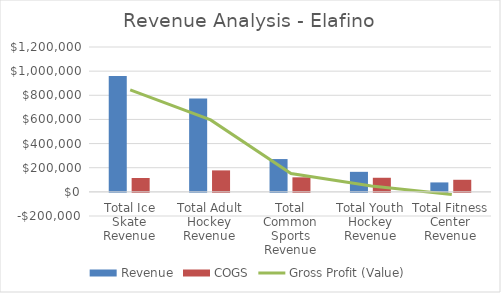
| Category | Revenue | COGS |
|---|---|---|
| Total Ice Skate Revenue | 960223 | 114783 |
| Total Adult Hockey Revenue | 773935 | 177822 |
| Total Common Sports Revenue | 271713 | 120368 |
| Total Youth Hockey Revenue | 165889 | 116712 |
| Total Fitness Center Revenue | 78180 | 100043 |